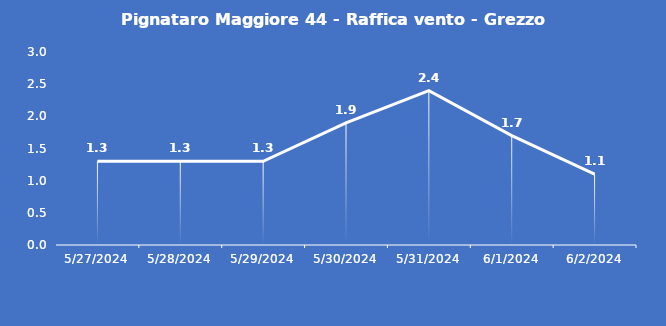
| Category | Pignataro Maggiore 44 - Raffica vento - Grezzo (m/s) |
|---|---|
| 5/27/24 | 1.3 |
| 5/28/24 | 1.3 |
| 5/29/24 | 1.3 |
| 5/30/24 | 1.9 |
| 5/31/24 | 2.4 |
| 6/1/24 | 1.7 |
| 6/2/24 | 1.1 |